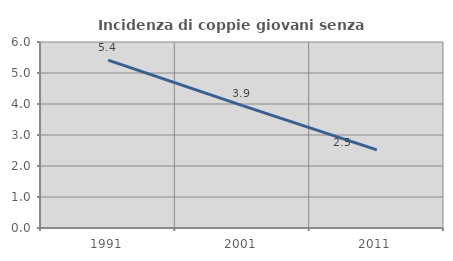
| Category | Incidenza di coppie giovani senza figli |
|---|---|
| 1991.0 | 5.414 |
| 2001.0 | 3.947 |
| 2011.0 | 2.519 |